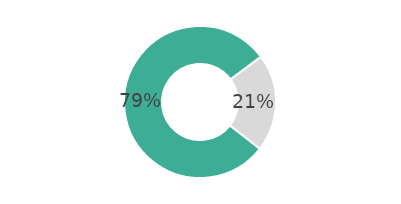
| Category | Series 0 |
|---|---|
| 0 | 79.296 |
| 1 | 20.704 |